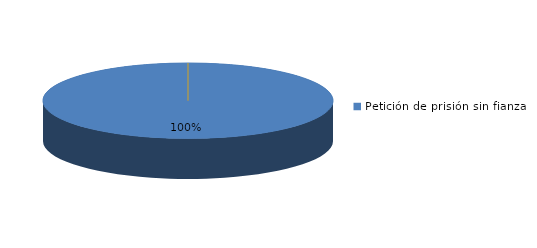
| Category | Series 0 |
|---|---|
| Petición de prisión sin fianza | 118 |
| Peticion de libertad con fianza | 0 |
| Petición de libertad | 0 |